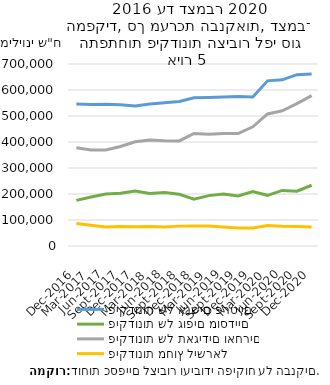
| Category | פיקדונות של אנשים פרטיים | פיקדונות של גופים מוסדיים | פיקדונות של תאגידים ואחרים | פיקדונות מחוץ לישראל |
|---|---|---|---|---|
| 2016-12-31 | 546310.2 | 175420.2 | 377516.9 | 86120 |
| 2017-03-31 | 544338.6 | 188199.6 | 369416.7 | 80199 |
| 2017-06-30 | 544821.2 | 200055.1 | 369337 | 72718 |
| 2017-09-30 | 543165.5 | 202698.3 | 382503.6 | 74884 |
| 2017-12-31 | 538771.6 | 211763.4 | 400952.1 | 73901 |
| 2018-03-31 | 545769.8 | 201715 | 407411.1 | 74876 |
| 2018-06-30 | 551300.6 | 206017.3 | 405087.7 | 73384 |
| 2018-09-30 | 555587.5 | 199132.7 | 404301.4 | 76443 |
| 2018-12-31 | 570076.2 | 180038.1 | 432729 | 76725 |
| 2019-03-31 | 571311 | 193810 | 429737.8 | 76617 |
| 2019-06-30 | 572956.8 | 199947.1 | 433150.5 | 73435 |
| 2019-09-30 | 575072.6 | 192170.5 | 432268.2 | 69365 |
| 2019-12-31 | 573339.9 | 209250.4 | 458465.3 | 69275 |
| 2020-03-31 | 635241.1 | 194897.4 | 507886.9 | 78535 |
| 2020-06-30 | 639021.1 | 213786.9 | 520007.6 | 75535 |
| 2020-09-30 | 659021.9 | 210973.2 | 547704.9 | 75384 |
| 2020-12-31 | 661376.1 | 233633.6 | 578152.5 | 72810 |